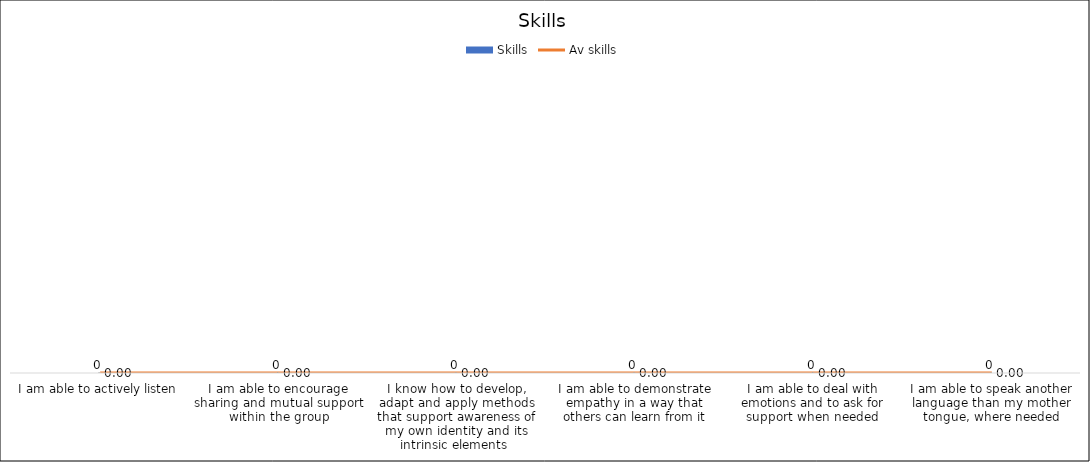
| Category | Skills |
|---|---|
| I am able to actively listen | 0 |
| I am able to encourage sharing and mutual support within the group | 0 |
| I know how to develop, adapt and apply methods that support awareness of my own identity and its intrinsic elements  | 0 |
| I am able to demonstrate empathy in a way that others can learn from it | 0 |
| I am able to deal with emotions and to ask for support when needed | 0 |
| I am able to speak another language than my mother tongue, where needed | 0 |